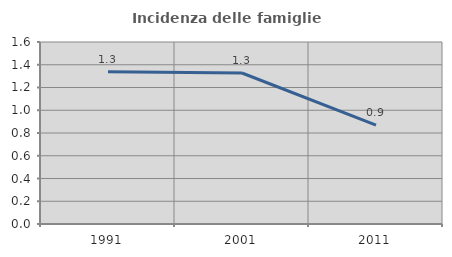
| Category | Incidenza delle famiglie numerose |
|---|---|
| 1991.0 | 1.339 |
| 2001.0 | 1.327 |
| 2011.0 | 0.87 |